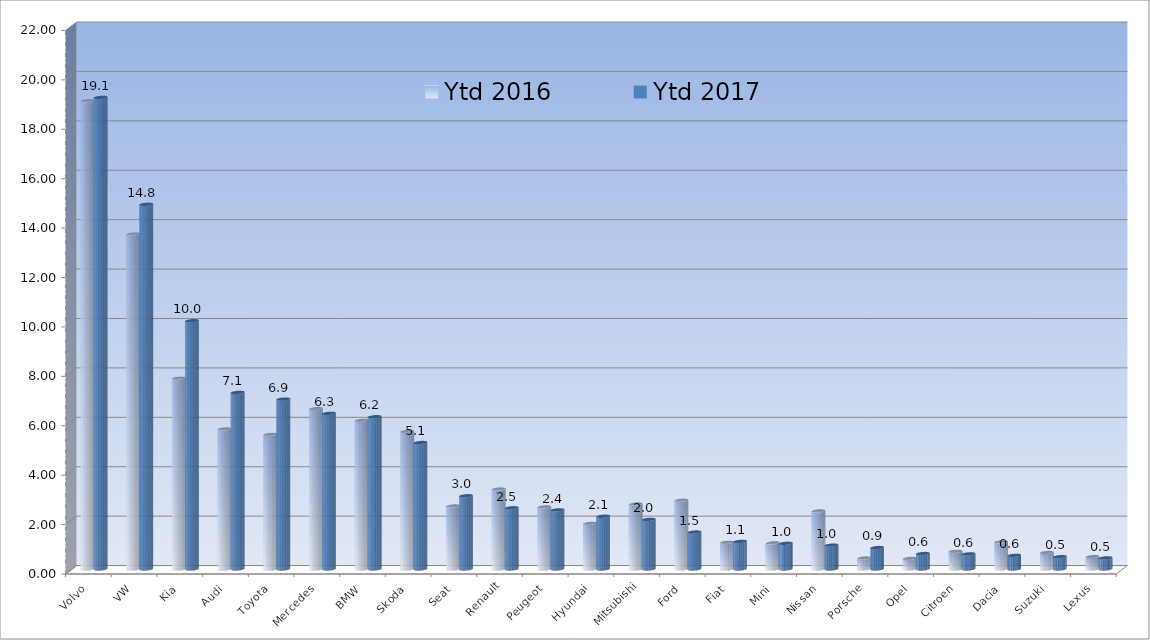
| Category | Ytd 2016 | Ytd 2017 |
|---|---|---|
| Volvo | 18.948 | 19.086 |
| VW | 13.554 | 14.761 |
| Kia | 7.722 | 10.05 |
| Audi | 5.665 | 7.15 |
| Toyota | 5.445 | 6.878 |
| Mercedes | 6.486 | 6.3 |
| BMW | 6.015 | 6.163 |
| Skoda | 5.567 | 5.119 |
| Seat | 2.549 | 2.963 |
| Renault | 3.232 | 2.477 |
| Peugeot | 2.508 | 2.392 |
| Hyundai | 1.845 | 2.135 |
| Mitsubishi | 2.625 | 2.009 |
| Ford | 2.783 | 1.497 |
| Fiat | 1.079 | 1.116 |
| Mini | 1.056 | 1.04 |
| Nissan | 2.346 | 0.966 |
| Porsche | 0.444 | 0.868 |
| Opel | 0.426 | 0.626 |
| Citroen | 0.712 | 0.612 |
| Dacia | 1.095 | 0.553 |
| Suzuki | 0.663 | 0.499 |
| Lexus | 0.497 | 0.451 |